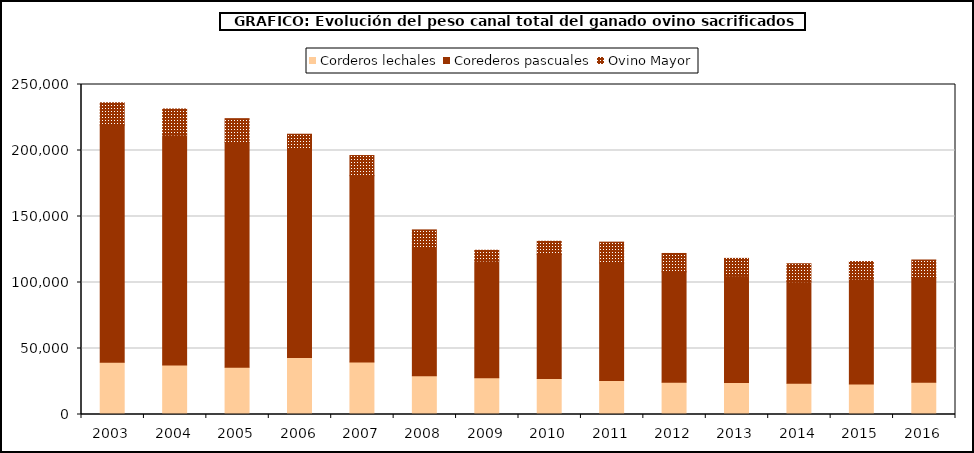
| Category | Corderos lechales | Corederos pascuales | Ovino Mayor |
|---|---|---|---|
| 2003.0 | 39573.4 | 179725.3 | 16855.9 |
| 2004.0 | 37496.969 | 174277.868 | 19688.149 |
| 2005.0 | 35754.734 | 170498.91 | 17872.177 |
| 2006.0 | 43265.425 | 158365.03 | 10706.408 |
| 2007.0 | 39690.287 | 141268.902 | 15229.867 |
| 2008.0 | 29352.285 | 97819.486 | 12681.385 |
| 2009.0 | 27925.256 | 88381.226 | 8117.939 |
| 2010.0 | 27286.013 | 93907.831 | 10041.667 |
| 2011.0 | 25698.493 | 89080.753 | 15807.735 |
| 2012.0 | 24460.359 | 83612.064 | 13930.517 |
| 2013.0 | 24211.15 | 80940.811 | 13108.832 |
| 2014.0 | 23588.116 | 77006.078 | 13625.766 |
| 2015.0 | 23076.847 | 79590.934 | 13196.397 |
| 2016.0 | 24442.917 | 79269.05 | 13341.651 |